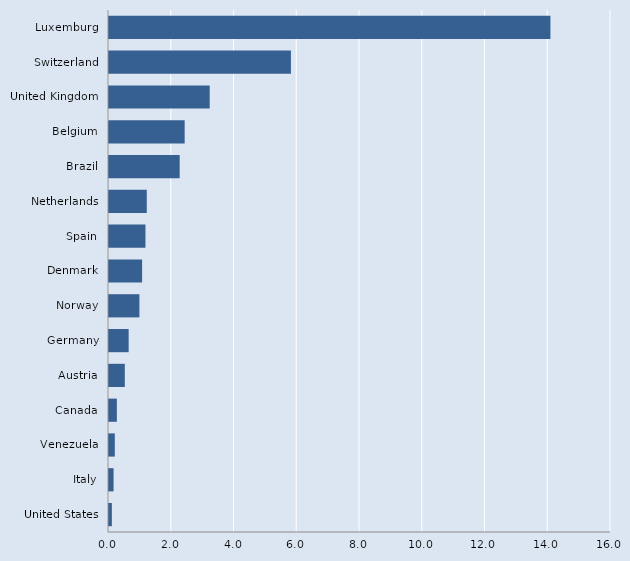
| Category | Series 0 |
|---|---|
| United States | 0.091 |
| Italy | 0.146 |
| Venezuela | 0.185 |
| Canada | 0.251 |
| Austria | 0.504 |
| Germany | 0.626 |
| Norway | 0.969 |
| Denmark | 1.055 |
| Spain | 1.162 |
| Netherlands | 1.204 |
| Brazil | 2.253 |
| Belgium | 2.412 |
| United Kingdom | 3.21 |
| Switzerland | 5.798 |
| Luxemburg | 14.069 |